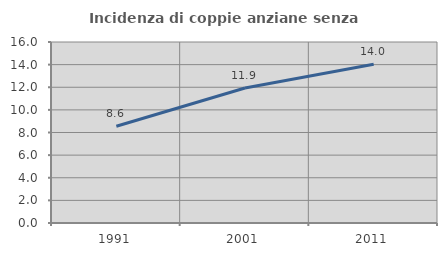
| Category | Incidenza di coppie anziane senza figli  |
|---|---|
| 1991.0 | 8.551 |
| 2001.0 | 11.939 |
| 2011.0 | 14.03 |